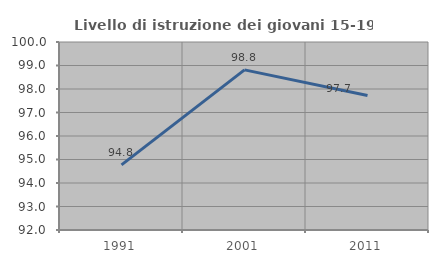
| Category | Livello di istruzione dei giovani 15-19 anni |
|---|---|
| 1991.0 | 94.769 |
| 2001.0 | 98.814 |
| 2011.0 | 97.727 |